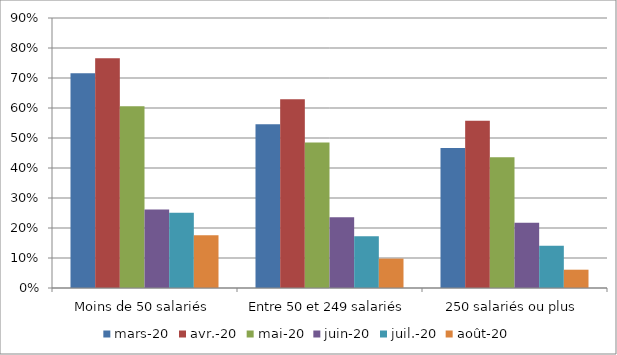
| Category | mars-20 | avr.-20 | mai-20 | juin-20 | juil.-20 | août-20 |
|---|---|---|---|---|---|---|
| Moins de 50 salariés | 0.716 | 0.766 | 0.606 | 0.261 | 0.251 | 0.175 |
| Entre 50 et 249 salariés | 0.546 | 0.629 | 0.485 | 0.236 | 0.172 | 0.098 |
| 250 salariés ou plus | 0.467 | 0.558 | 0.436 | 0.218 | 0.141 | 0.061 |